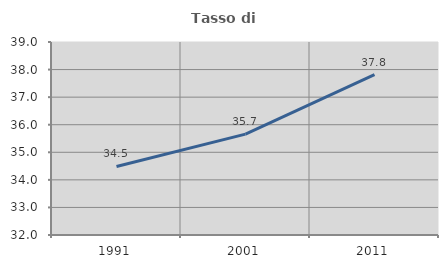
| Category | Tasso di occupazione   |
|---|---|
| 1991.0 | 34.487 |
| 2001.0 | 35.66 |
| 2011.0 | 37.819 |